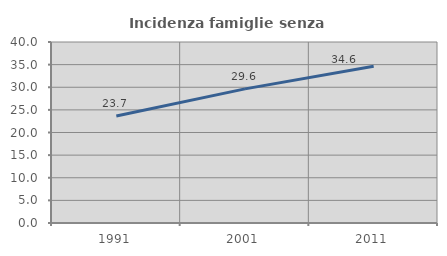
| Category | Incidenza famiglie senza nuclei |
|---|---|
| 1991.0 | 23.666 |
| 2001.0 | 29.645 |
| 2011.0 | 34.624 |